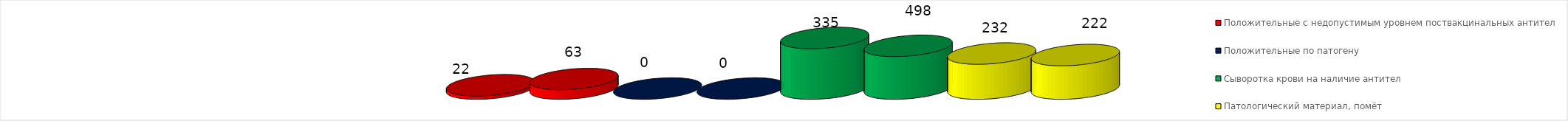
| Category | Положительные с недопустимым уровнем поствакцинальных антител | Положительные по патогену | Сыворотка крови на наличие антител | Патологический материал, помёт |
|---|---|---|---|---|
| Сыворотка крови на наличие антител | 63 | 0 | 283 | 222 |